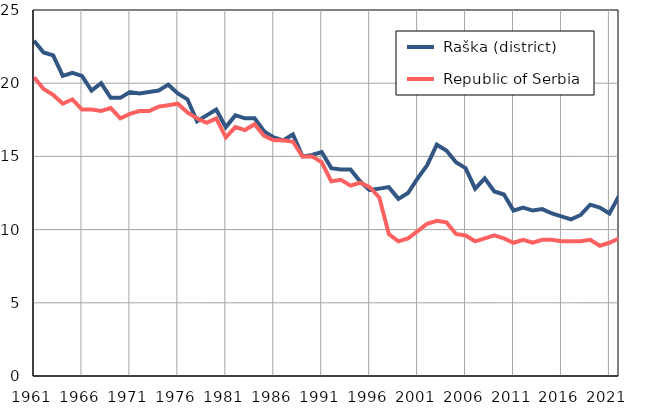
| Category |  Raška (district) |  Republic of Serbia |
|---|---|---|
| 1961.0 | 22.9 | 20.4 |
| 1962.0 | 22.1 | 19.6 |
| 1963.0 | 21.9 | 19.2 |
| 1964.0 | 20.5 | 18.6 |
| 1965.0 | 20.7 | 18.9 |
| 1966.0 | 20.5 | 18.2 |
| 1967.0 | 19.5 | 18.2 |
| 1968.0 | 20 | 18.1 |
| 1969.0 | 19 | 18.3 |
| 1970.0 | 19 | 17.6 |
| 1971.0 | 19.4 | 17.9 |
| 1972.0 | 19.3 | 18.1 |
| 1973.0 | 19.4 | 18.1 |
| 1974.0 | 19.5 | 18.4 |
| 1975.0 | 19.9 | 18.5 |
| 1976.0 | 19.3 | 18.6 |
| 1977.0 | 18.9 | 18 |
| 1978.0 | 17.4 | 17.6 |
| 1979.0 | 17.8 | 17.3 |
| 1980.0 | 18.2 | 17.6 |
| 1981.0 | 17 | 16.3 |
| 1982.0 | 17.8 | 17 |
| 1983.0 | 17.6 | 16.8 |
| 1984.0 | 17.6 | 17.2 |
| 1985.0 | 16.7 | 16.4 |
| 1986.0 | 16.3 | 16.1 |
| 1987.0 | 16.1 | 16.1 |
| 1988.0 | 16.5 | 16 |
| 1989.0 | 15 | 15 |
| 1990.0 | 15.1 | 15 |
| 1991.0 | 15.3 | 14.6 |
| 1992.0 | 14.2 | 13.3 |
| 1993.0 | 14.1 | 13.4 |
| 1994.0 | 14.1 | 13 |
| 1995.0 | 13.3 | 13.2 |
| 1996.0 | 12.7 | 12.9 |
| 1997.0 | 12.8 | 12.2 |
| 1998.0 | 12.9 | 9.7 |
| 1999.0 | 12.1 | 9.2 |
| 2000.0 | 12.5 | 9.4 |
| 2001.0 | 13.5 | 9.9 |
| 2002.0 | 14.4 | 10.4 |
| 2003.0 | 15.8 | 10.6 |
| 2004.0 | 15.4 | 10.5 |
| 2005.0 | 14.6 | 9.7 |
| 2006.0 | 14.2 | 9.6 |
| 2007.0 | 12.8 | 9.2 |
| 2008.0 | 13.5 | 9.4 |
| 2009.0 | 12.6 | 9.6 |
| 2010.0 | 12.4 | 9.4 |
| 2011.0 | 11.3 | 9.1 |
| 2012.0 | 11.5 | 9.3 |
| 2013.0 | 11.3 | 9.1 |
| 2014.0 | 11.4 | 9.3 |
| 2015.0 | 11.1 | 9.3 |
| 2016.0 | 10.9 | 9.2 |
| 2017.0 | 10.7 | 9.2 |
| 2018.0 | 11 | 9.2 |
| 2019.0 | 11.7 | 9.3 |
| 2020.0 | 11.5 | 8.9 |
| 2021.0 | 11.1 | 9.1 |
| 2022.0 | 12.3 | 9.4 |